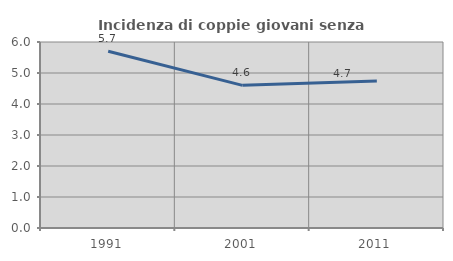
| Category | Incidenza di coppie giovani senza figli |
|---|---|
| 1991.0 | 5.7 |
| 2001.0 | 4.602 |
| 2011.0 | 4.742 |